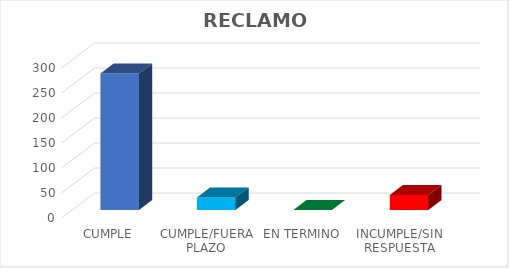
| Category | Series 0 |
|---|---|
| CUMPLE | 273 |
| CUMPLE/FUERA PLAZO | 25 |
| EN TERMINO | 0 |
| INCUMPLE/SIN RESPUESTA | 30 |